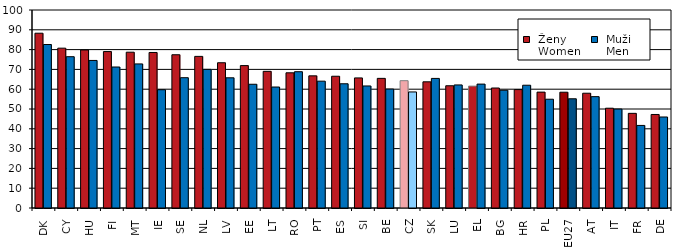
| Category |  Ženy 
 Women |  Muži 
 Men |
|---|---|---|
| DK | 88.275 | 82.576 |
| CY | 80.726 | 76.414 |
| HU | 79.808 | 74.526 |
| FI | 79.007 | 71.206 |
| MT | 78.685 | 72.772 |
| IE | 78.549 | 59.73 |
| SE | 77.404 | 65.808 |
| NL | 76.575 | 70.024 |
| LV | 73.366 | 65.754 |
| EE | 71.922 | 62.499 |
| LT | 69.023 | 61.103 |
| RO | 68.277 | 68.832 |
| PT | 66.739 | 64.06 |
| ES | 66.548 | 62.744 |
| SI | 65.698 | 61.639 |
| BE | 65.472 | 60.076 |
| CZ | 64.307 | 58.614 |
| SK | 63.726 | 65.447 |
| LU | 61.738 | 62.157 |
| EL | 61.559 | 62.572 |
| BG | 60.605 | 59.474 |
| HR | 59.802 | 62.009 |
| PL | 58.528 | 54.939 |
| EU27 | 58.481 | 55.163 |
| AT | 57.969 | 56.246 |
| IT | 50.398 | 49.974 |
| FR | 47.803 | 41.703 |
| DE | 47.234 | 45.965 |